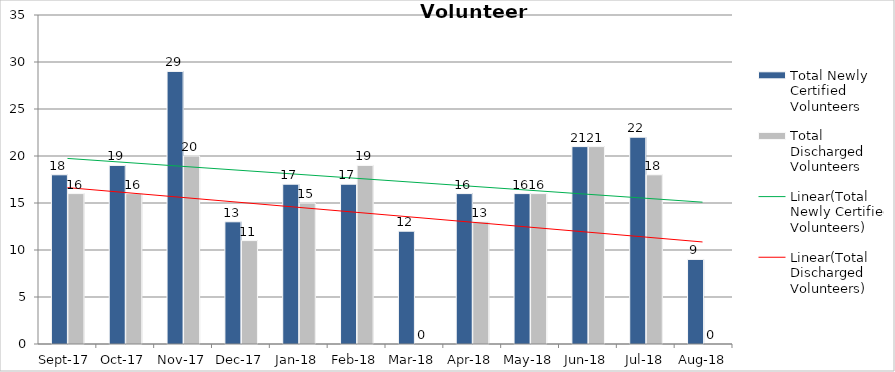
| Category | Total Newly Certified Volunteers | Total Discharged Volunteers |
|---|---|---|
| 2017-09-01 | 18 | 16 |
| 2017-10-01 | 19 | 16 |
| 2017-11-01 | 29 | 20 |
| 2017-12-01 | 13 | 11 |
| 2018-01-01 | 17 | 15 |
| 2018-02-01 | 17 | 19 |
| 2018-03-01 | 12 | 0 |
| 2018-04-01 | 16 | 13 |
| 2018-05-01 | 16 | 16 |
| 2018-06-01 | 21 | 21 |
| 2018-07-01 | 22 | 18 |
| 2018-08-01 | 9 | 0 |